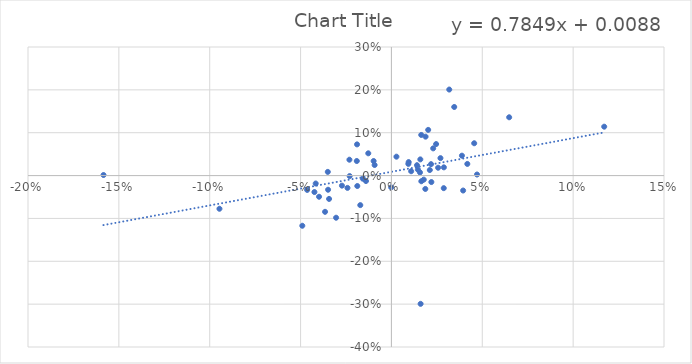
| Category | Series 0 |
|---|---|
| -0.014019211951660034 | -0.013 |
| 0.047098035939027914 | 0.002 |
| -0.03653067415284579 | -0.085 |
| 0.00949834918003795 | 0.031 |
| 0.015902410550382582 | 0.038 |
| -0.019058568230375383 | 0.034 |
| 0.018653971816085788 | -0.031 |
| -0.0189288199277815 | 0.073 |
| 0.04555091700254116 | 0.075 |
| -0.02298644771656342 | -0.001 |
| -0.03501448443753017 | 0.009 |
| -0.027232791207475526 | -0.024 |
| 0.06479781594892581 | 0.136 |
| 0.026982147179683218 | 0.041 |
| -0.012739041838623314 | 0.052 |
| 0.014564366986886786 | 0.014 |
| -0.03431939858633536 | -0.054 |
| -0.00013478395706274346 | -0.028 |
| -0.049046364434921025 | -0.117 |
| -0.01713837977286887 | -0.069 |
| -0.04237172106086446 | -0.038 |
| 0.03456253603901223 | 0.16 |
| 0.021116940862525593 | 0.013 |
| 0.021793481166603016 | 0.027 |
| 0.024590872620775993 | 0.073 |
| -0.03044946384446256 | -0.098 |
| 0.025688521864162768 | 0.018 |
| 0.021981854153895926 | -0.015 |
| -0.04167274578202328 | -0.019 |
| 0.016413063016382793 | 0.095 |
| -0.018779861197456872 | -0.024 |
| 0.016451554983731527 | -0.013 |
| 0.020224678501166604 | 0.107 |
| -0.03486579086600913 | -0.033 |
| -0.09464256523533729 | -0.077 |
| -0.15844251355456238 | 0.001 |
| 0.04176776305414552 | 0.027 |
| 0.028800907069936394 | -0.029 |
| 0.009308637601993028 | 0.027 |
| -0.03982982725795683 | -0.049 |
| 0.015716094050336034 | 0.007 |
| -0.02418846071323749 | -0.029 |
| -0.04637952228150114 | -0.033 |
| 0.11709566393153178 | 0.114 |
| 0.02886278034047839 | 0.019 |
| -0.009793178791458248 | 0.034 |
| 0.0160608268943267 | -0.299 |
| 0.0318219325106186 | 0.201 |
| 0.03945925075020279 | -0.035 |
| 0.010850016024065844 | 0.01 |
| -0.009251329513694997 | 0.025 |
| 0.0027554567982496976 | 0.044 |
| 0.018794005903765627 | 0.091 |
| -0.015757381436827363 | -0.007 |
| 0.022979725432336517 | 0.063 |
| -0.023124084687128135 | 0.037 |
| 0.03880410875172684 | 0.046 |
| 0.0140691313766099 | 0.024 |
| 0.017783725456192334 | -0.009 |